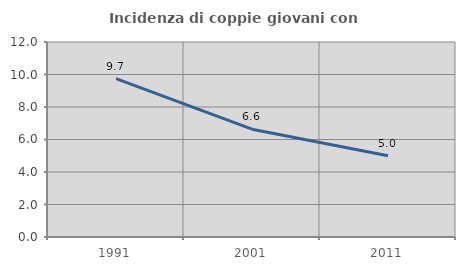
| Category | Incidenza di coppie giovani con figli |
|---|---|
| 1991.0 | 9.744 |
| 2001.0 | 6.635 |
| 2011.0 | 5 |